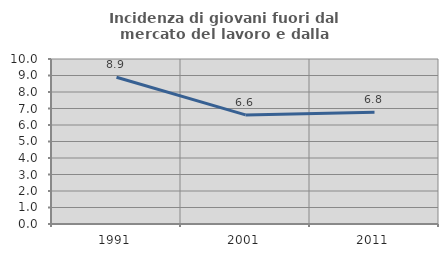
| Category | Incidenza di giovani fuori dal mercato del lavoro e dalla formazione  |
|---|---|
| 1991.0 | 8.894 |
| 2001.0 | 6.614 |
| 2011.0 | 6.774 |